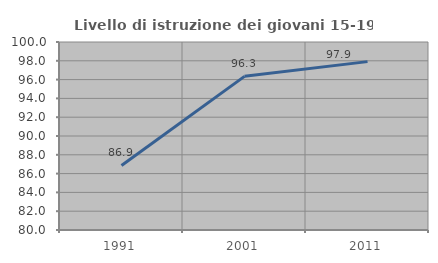
| Category | Livello di istruzione dei giovani 15-19 anni |
|---|---|
| 1991.0 | 86.863 |
| 2001.0 | 96.346 |
| 2011.0 | 97.911 |